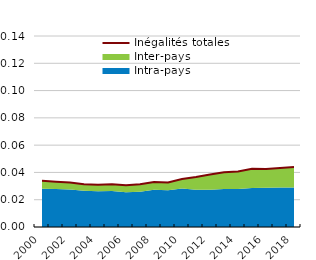
| Category | Inégalités totales |
|---|---|
| 2000.0 | 0.034 |
| 2001.0 | 0.033 |
| 2002.0 | 0.033 |
| 2003.0 | 0.031 |
| 2004.0 | 0.031 |
| 2005.0 | 0.031 |
| 2006.0 | 0.031 |
| 2007.0 | 0.031 |
| 2008.0 | 0.033 |
| 2009.0 | 0.033 |
| 2010.0 | 0.035 |
| 2011.0 | 0.037 |
| 2012.0 | 0.039 |
| 2013.0 | 0.04 |
| 2014.0 | 0.041 |
| 2015.0 | 0.043 |
| 2016.0 | 0.043 |
| 2017.0 | 0.043 |
| 2018.0 | 0.044 |